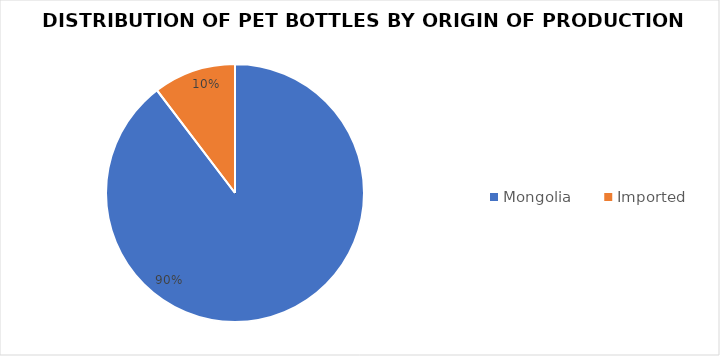
| Category | Series 0 |
|---|---|
| Mongolia | 5984 |
| Imported | 690 |